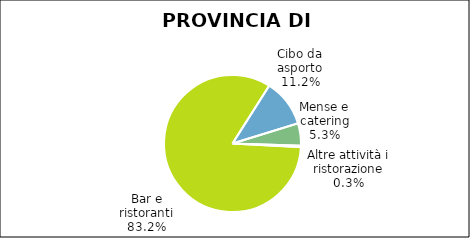
| Category | Provincia di Varese |
|---|---|
| Bar e ristoranti | 4407 |
| Cibo da asporto | 596 |
| Mense e catering | 280 |
| Altre attività i ristorazione | 16 |